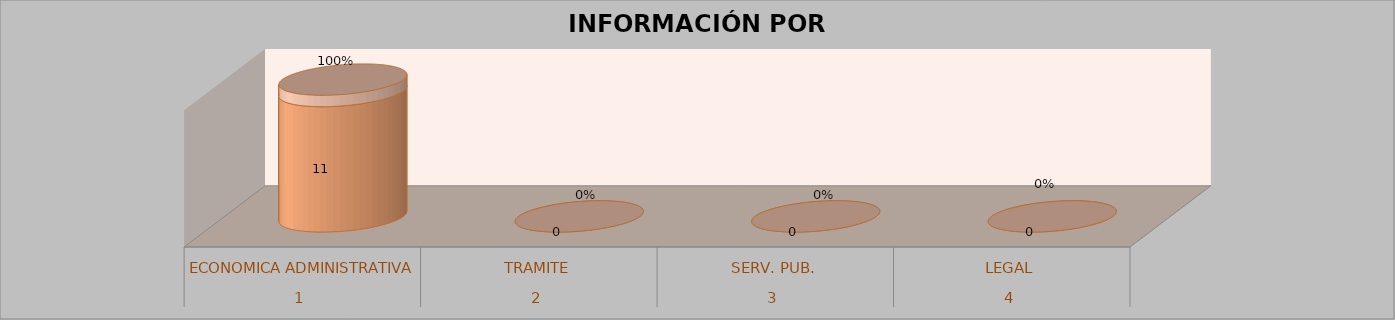
| Category | Series 0 | Series 1 | Series 2 | Series 3 |
|---|---|---|---|---|
| 0 |  |  | 11 | 1 |
| 1 |  |  | 0 | 0 |
| 2 |  |  | 0 | 0 |
| 3 |  |  | 0 | 0 |